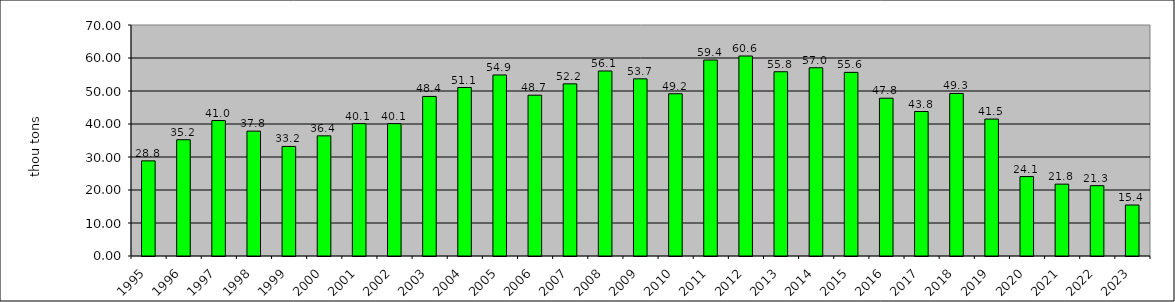
| Category | Series 0 |
|---|---|
| 1995.0 | 28.83 |
| 1996.0 | 35.23 |
| 1997.0 | 41.04 |
| 1998.0 | 37.84 |
| 1999.0 | 33.199 |
| 2000.0 | 36.41 |
| 2001.0 | 40.099 |
| 2002.0 | 40.099 |
| 2003.0 | 48.355 |
| 2004.0 | 51.059 |
| 2005.0 | 54.857 |
| 2006.0 | 48.729 |
| 2007.0 | 52.164 |
| 2008.0 | 56.061 |
| 2009.0 | 53.679 |
| 2010.0 | 49.165 |
| 2011.0 | 59.385 |
| 2012.0 | 60.602 |
| 2013.0 | 55.83 |
| 2014.0 | 57.04 |
| 2015.0 | 55.644 |
| 2016.0 | 47.813 |
| 2017.0 | 43.786 |
| 2018.0 | 49.26 |
| 2019.0 | 41.492 |
| 2020.0 | 24.058 |
| 2021.0 | 21.773 |
| 2022.0 | 21.306 |
| 2023.0 | 15.447 |